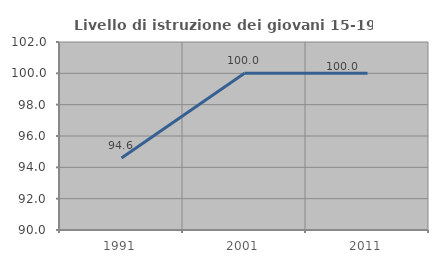
| Category | Livello di istruzione dei giovani 15-19 anni |
|---|---|
| 1991.0 | 94.595 |
| 2001.0 | 100 |
| 2011.0 | 100 |